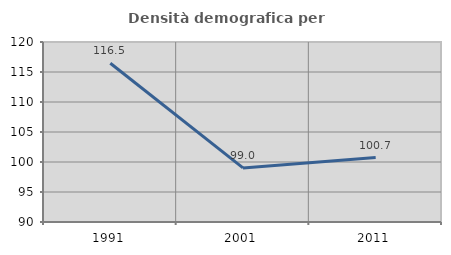
| Category | Densità demografica |
|---|---|
| 1991.0 | 116.458 |
| 2001.0 | 99.018 |
| 2011.0 | 100.733 |